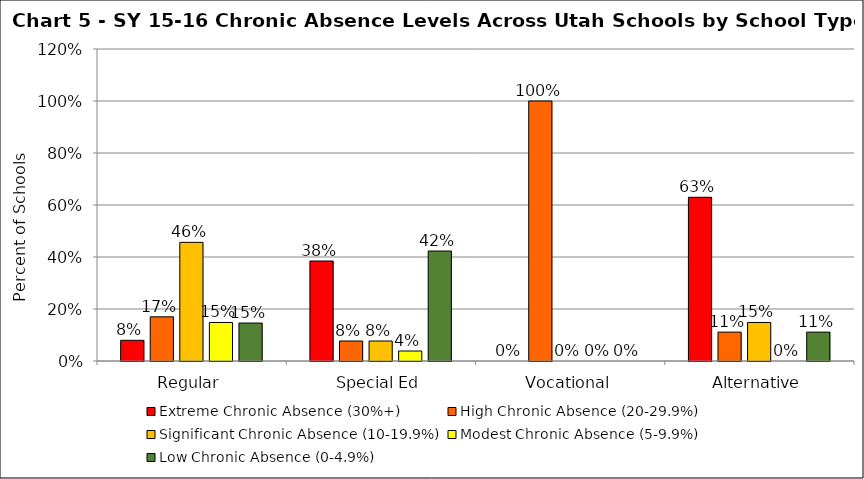
| Category | Extreme Chronic Absence (30%+) | High Chronic Absence (20-29.9%) | Significant Chronic Absence (10-19.9%) | Modest Chronic Absence (5-9.9%) | Low Chronic Absence (0-4.9%) |
|---|---|---|---|---|---|
| 0 | 0.08 | 0.17 | 0.456 | 0.148 | 0.146 |
| 1 | 0.385 | 0.077 | 0.077 | 0.038 | 0.423 |
| 2 | 0 | 1 | 0 | 0 | 0 |
| 3 | 0.63 | 0.111 | 0.148 | 0 | 0.111 |